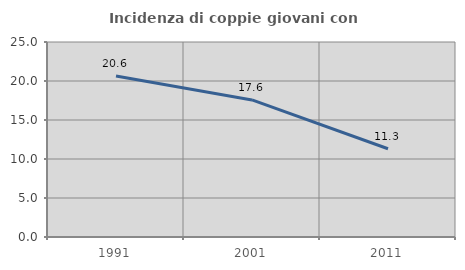
| Category | Incidenza di coppie giovani con figli |
|---|---|
| 1991.0 | 20.645 |
| 2001.0 | 17.571 |
| 2011.0 | 11.315 |